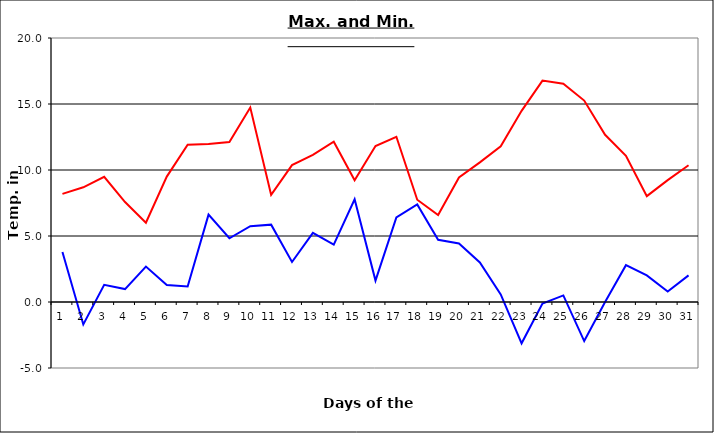
| Category | Series 0 | Series 1 |
|---|---|---|
| 0 | 8.19 | 3.79 |
| 1 | 8.69 | -1.7 |
| 2 | 9.48 | 1.3 |
| 3 | 7.57 | 0.98 |
| 4 | 6.01 | 2.68 |
| 5 | 9.5 | 1.28 |
| 6 | 11.92 | 1.17 |
| 7 | 11.97 | 6.62 |
| 8 | 12.12 | 4.83 |
| 9 | 14.73 | 5.74 |
| 10 | 8.11 | 5.86 |
| 11 | 10.37 | 3.03 |
| 12 | 11.14 | 5.24 |
| 13 | 12.14 | 4.35 |
| 14 | 9.23 | 7.78 |
| 15 | 11.82 | 1.62 |
| 16 | 12.52 | 6.4 |
| 17 | 7.75 | 7.39 |
| 18 | 6.59 | 4.71 |
| 19 | 9.43 | 4.44 |
| 20 | 10.58 | 3 |
| 21 | 11.8 | 0.57 |
| 22 | 14.48 | -3.13 |
| 23 | 16.77 | -0.11 |
| 24 | 16.53 | 0.5 |
| 25 | 15.26 | -2.96 |
| 26 | 12.67 | 0 |
| 27 | 11.07 | 2.79 |
| 28 | 8.02 | 2.01 |
| 29 | 9.23 | 0.8 |
| 30 | 10.36 | 2.02 |